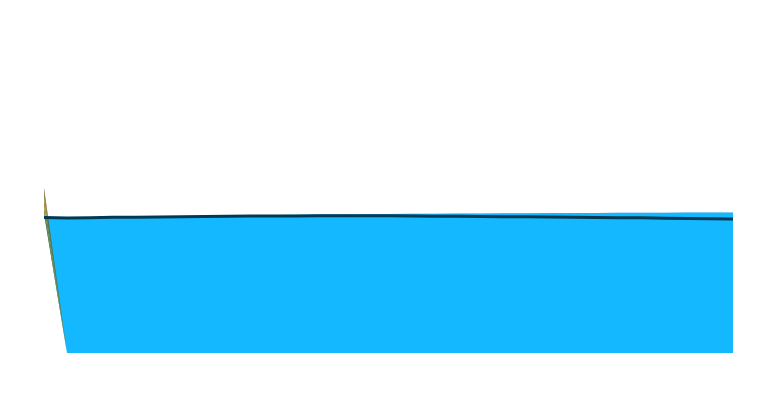
| Category | Australia and New Zealand Ref |
|---|---|
| 2020.0 | -3.356 |
| 2021.0 | -3.525 |
| 2022.0 | -3.46 |
| 2023.0 | -3.297 |
| 2024.0 | -3.285 |
| 2025.0 | -3.23 |
| 2026.0 | -3.171 |
| 2027.0 | -3.097 |
| 2028.0 | -3.039 |
| 2029.0 | -3.002 |
| 2030.0 | -2.964 |
| 2031.0 | -2.942 |
| 2032.0 | -2.929 |
| 2033.0 | -2.922 |
| 2034.0 | -2.924 |
| 2035.0 | -2.935 |
| 2036.0 | -2.969 |
| 2037.0 | -3.007 |
| 2038.0 | -3.054 |
| 2039.0 | -3.095 |
| 2040.0 | -3.152 |
| 2041.0 | -3.194 |
| 2042.0 | -3.24 |
| 2043.0 | -3.296 |
| 2044.0 | -3.351 |
| 2045.0 | -3.413 |
| 2046.0 | -3.466 |
| 2047.0 | -3.554 |
| 2048.0 | -3.623 |
| 2049.0 | -3.692 |
| 2050.0 | -3.794 |